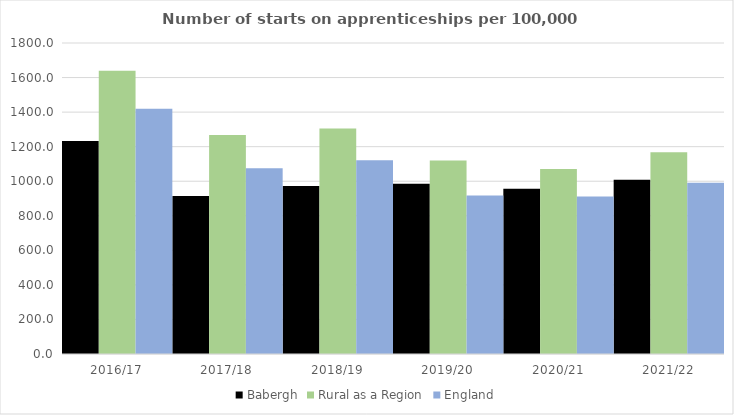
| Category | Babergh | Rural as a Region | England |
|---|---|---|---|
| 2016/17 | 1233 | 1638.789 | 1420 |
| 2017/18 | 915 | 1267.474 | 1075 |
| 2018/19 | 972 | 1304.57 | 1122 |
| 2019/20 | 985 | 1119.662 | 918 |
| 2020/21 | 956 | 1070.748 | 912 |
| 2021/22 | 1009 | 1167.68 | 991 |